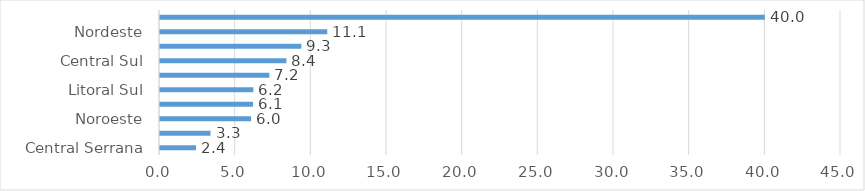
| Category | Series 0 |
|---|---|
| Central Serrana | 2.382 |
| Sudoeste Serrana | 3.338 |
| Noroeste | 6.019 |
| Caparaó | 6.147 |
| Litoral Sul | 6.17 |
| Centro-Oeste | 7.227 |
| Central Sul | 8.353 |
| Rio Doce | 9.343 |
| Nordeste | 11.053 |
| Metropolitana | 39.968 |